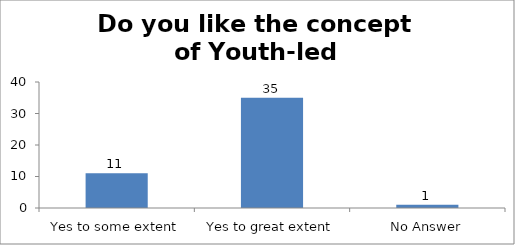
| Category | Do you like the concept of Youth-led Changemaking?  |
|---|---|
| Yes to some extent | 11 |
| Yes to great extent | 35 |
| No Answer | 1 |